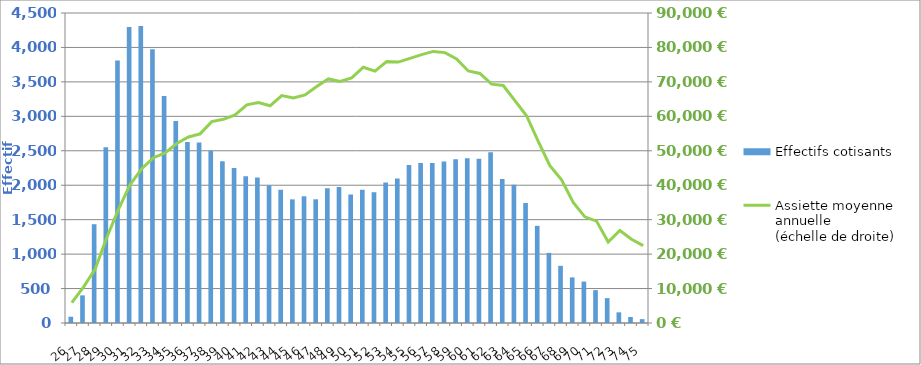
| Category | Effectifs cotisants |
|---|---|
| 26.0 | 91 |
| 27.0 | 401 |
| 28.0 | 1434 |
| 29.0 | 2553 |
| 30.0 | 3812 |
| 31.0 | 4297 |
| 32.0 | 4311 |
| 33.0 | 3973 |
| 34.0 | 3294 |
| 35.0 | 2933 |
| 36.0 | 2627 |
| 37.0 | 2620 |
| 38.0 | 2501 |
| 39.0 | 2349 |
| 40.0 | 2250 |
| 41.0 | 2132 |
| 42.0 | 2111 |
| 43.0 | 2001 |
| 44.0 | 1936 |
| 45.0 | 1795 |
| 46.0 | 1839 |
| 47.0 | 1796 |
| 48.0 | 1955 |
| 49.0 | 1976 |
| 50.0 | 1864 |
| 51.0 | 1936 |
| 52.0 | 1897 |
| 53.0 | 2039 |
| 54.0 | 2097 |
| 55.0 | 2294 |
| 56.0 | 2324 |
| 57.0 | 2322 |
| 58.0 | 2344 |
| 59.0 | 2376 |
| 60.0 | 2391 |
| 61.0 | 2385 |
| 62.0 | 2477 |
| 63.0 | 2092 |
| 64.0 | 2008 |
| 65.0 | 1742 |
| 66.0 | 1410 |
| 67.0 | 1018 |
| 68.0 | 830 |
| 69.0 | 662 |
| 70.0 | 601 |
| 71.0 | 477 |
| 72.0 | 361 |
| 73.0 | 155 |
| 74.0 | 87 |
| 75.0 | 56 |